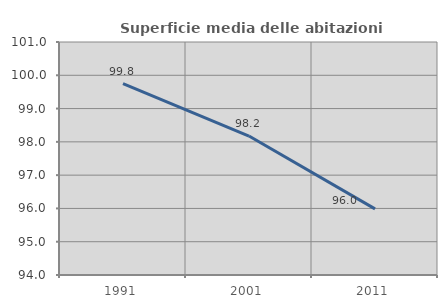
| Category | Superficie media delle abitazioni occupate |
|---|---|
| 1991.0 | 99.751 |
| 2001.0 | 98.175 |
| 2011.0 | 95.987 |